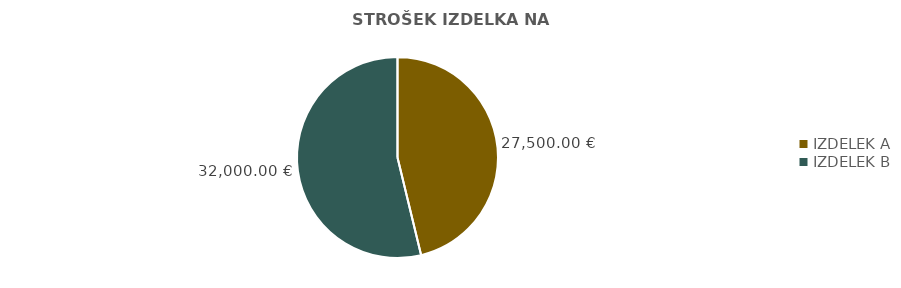
| Category | STROŠEK IZDELKA NA ENOTO |
|---|---|
| IZDELEK A | 27500 |
| IZDELEK B | 32000 |